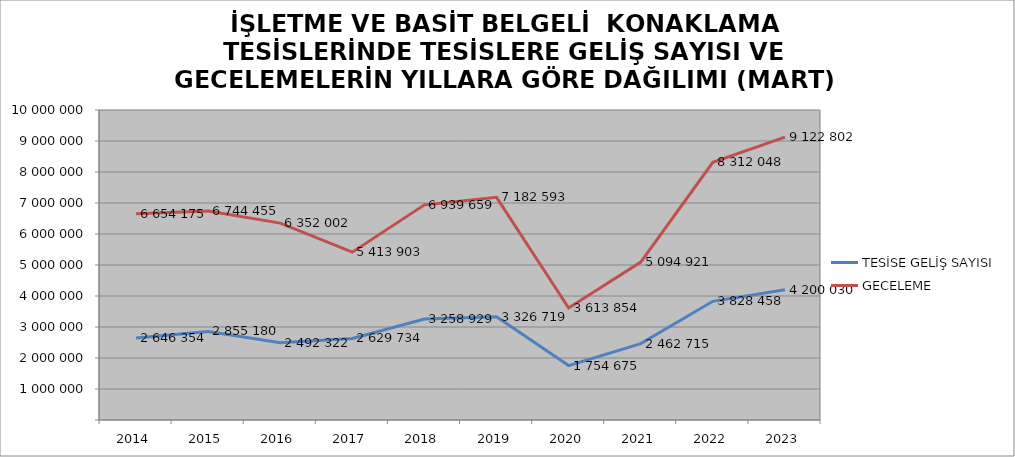
| Category | TESİSE GELİŞ SAYISI | GECELEME |
|---|---|---|
| 2014 | 2646354 | 6654175 |
| 2015 | 2855180 | 6744455 |
| 2016 | 2492322 | 6352002 |
| 2017 | 2629734 | 5413903 |
| 2018 | 3258929 | 6939659 |
| 2019 | 3326719 | 7182593 |
| 2020 | 1754675 | 3613854 |
| 2021 | 2462715 | 5094921 |
| 2022 | 3828458 | 8312048 |
| 2023 | 4200030 | 9122802 |